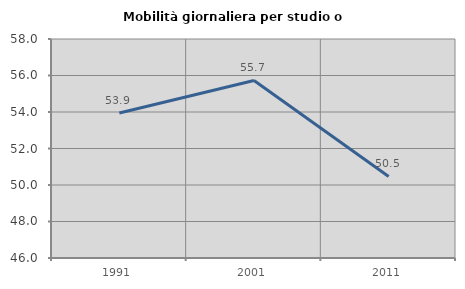
| Category | Mobilità giornaliera per studio o lavoro |
|---|---|
| 1991.0 | 53.948 |
| 2001.0 | 55.729 |
| 2011.0 | 50.467 |